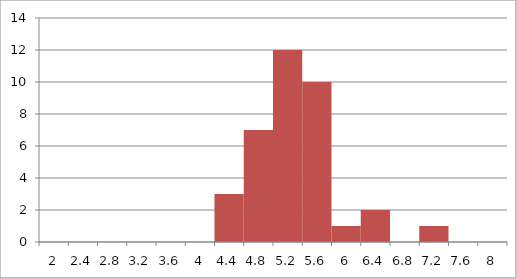
| Category | Series 1 |
|---|---|
| 2.0 | 0 |
| 2.4 | 0 |
| 2.8 | 0 |
| 3.2 | 0 |
| 3.6 | 0 |
| 4.0 | 0 |
| 4.4 | 3 |
| 4.8 | 7 |
| 5.2 | 12 |
| 5.6 | 10 |
| 6.0 | 1 |
| 6.4 | 2 |
| 6.8 | 0 |
| 7.2 | 1 |
| 7.6 | 0 |
| 8.0 | 0 |